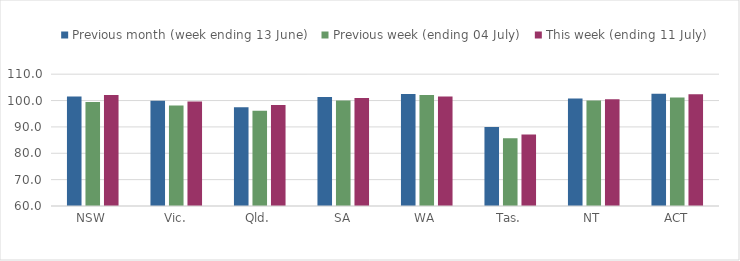
| Category | Previous month (week ending 13 June) | Previous week (ending 04 July) | This week (ending 11 July) |
|---|---|---|---|
| NSW | 101.551 | 99.446 | 102.106 |
| Vic. | 99.969 | 98.129 | 99.623 |
| Qld. | 97.486 | 96.132 | 98.301 |
| SA | 101.392 | 99.989 | 100.919 |
| WA | 102.529 | 102.081 | 101.574 |
| Tas. | 89.982 | 85.653 | 87.147 |
| NT | 100.739 | 100 | 100.492 |
| ACT | 102.542 | 101.15 | 102.432 |